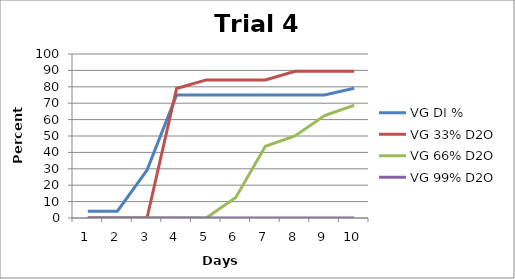
| Category | VG DI % | VG 33% D2O | VG 66% D2O | VG 99% D2O |
|---|---|---|---|---|
| 0 | 4.167 | 0 | 0 | 0 |
| 1 | 4.167 | 0 | 0 | 0 |
| 2 | 29.167 | 0 | 0 | 0 |
| 3 | 75 | 78.947 | 0 | 0 |
| 4 | 75 | 84.211 | 0 | 0 |
| 5 | 75 | 84.211 | 12.5 | 0 |
| 6 | 75 | 84.211 | 43.75 | 0 |
| 7 | 75 | 89.474 | 50 | 0 |
| 8 | 75 | 89.474 | 62.5 | 0 |
| 9 | 79.167 | 89.474 | 68.75 | 0 |